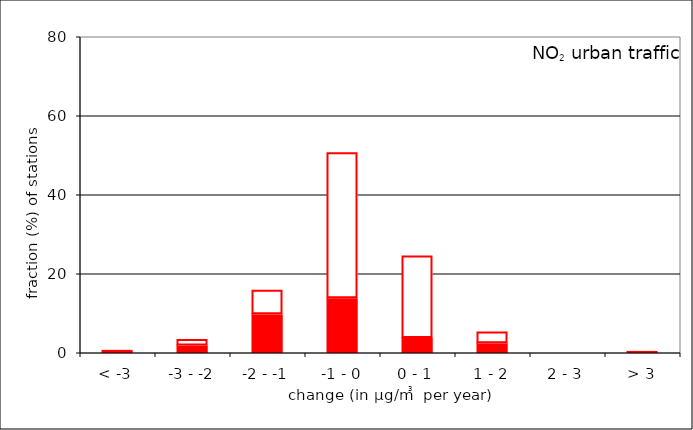
| Category | sig P>0.1 | P<0.1 |
|---|---|---|
| < -3 | 0.543 | 0 |
| -3 - -2 | 1.902 | 1.359 |
| -2 - -1 | 9.783 | 5.978 |
| -1 - 0 | 13.859 | 36.685 |
| 0 - 1 | 3.804 | 20.652 |
| 1 - 2 | 2.446 | 2.717 |
| 2 - 3 | 0 | 0 |
| > 3 | 0.272 | 0 |